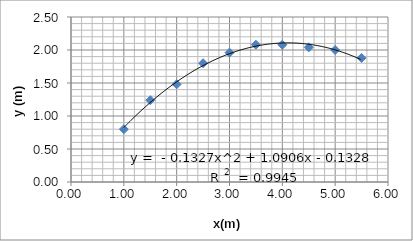
| Category | y(m) |
|---|---|
| 1.0 | 0.8 |
| 1.5 | 1.24 |
| 2.0 | 1.48 |
| 2.5 | 1.8 |
| 3.0 | 1.96 |
| 3.5 | 2.08 |
| 4.0 | 2.08 |
| 4.5 | 2.04 |
| 5.0 | 2 |
| 5.5 | 1.88 |